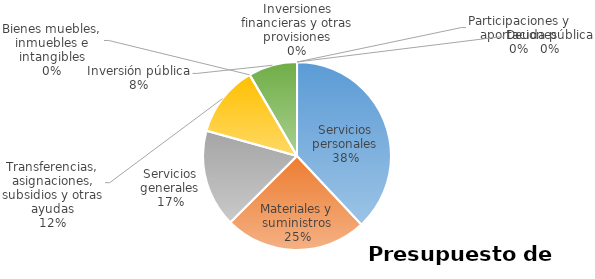
| Category | Series 0 | Series 1 | Series 2 | Series 3 | Series 4 | Series 5 |
|---|---|---|---|---|---|---|
| Servicios personales | 36925239 |  |  |  |  |  |
| Materiales y suministros | 23812519 |  |  |  |  |  |
| Servicios generales | 16315651 |  |  |  |  |  |
| Transferencias, asignaciones, subsidios y otras ayudas | 11920000 |  |  |  |  |  |
| Bienes muebles, inmuebles e intangibles | 0 |  |  |  |  |  |
| Inversión pública | 8168610 |  |  |  |  |  |
| Inversiones financieras y otras provisiones | 0 |  |  |  |  |  |
| Participaciones y aportaciones | 0 |  |  |  |  |  |
| Deuda pública | 0 |  |  |  |  |  |